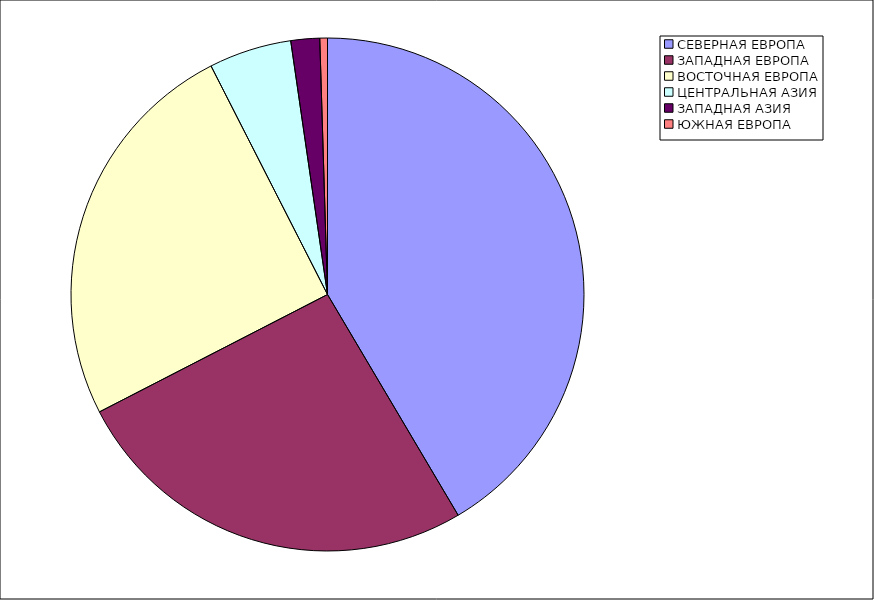
| Category | Оборот |
|---|---|
| СЕВЕРНАЯ ЕВРОПА | 41.493 |
| ЗАПАДНАЯ ЕВРОПА | 25.94 |
| ВОСТОЧНАЯ ЕВРОПА | 25.065 |
| ЦЕНТРАЛЬНАЯ АЗИЯ | 5.209 |
| ЗАПАДНАЯ АЗИЯ | 1.811 |
| ЮЖНАЯ ЕВРОПА | 0.481 |